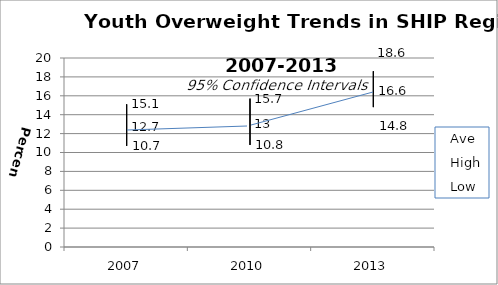
| Category | Ave | High | Low |
|---|---|---|---|
| 2007.0 | 12.7 | 15.1 | 10.7 |
| 2010.0 | 13 | 15.7 | 10.8 |
| 2013.0 | 16.6 | 18.6 | 14.8 |